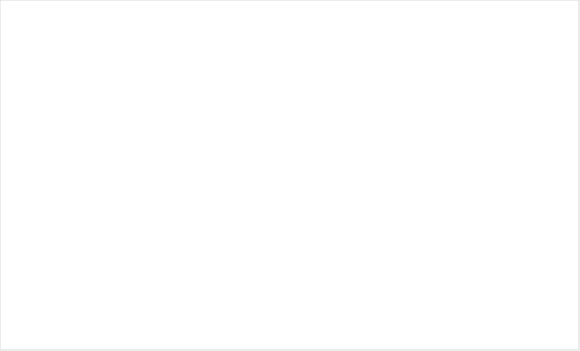
| Category | Итог |
|---|---|
| 10 | 11 |
| 1 | 3 |
| 5 | 2 |